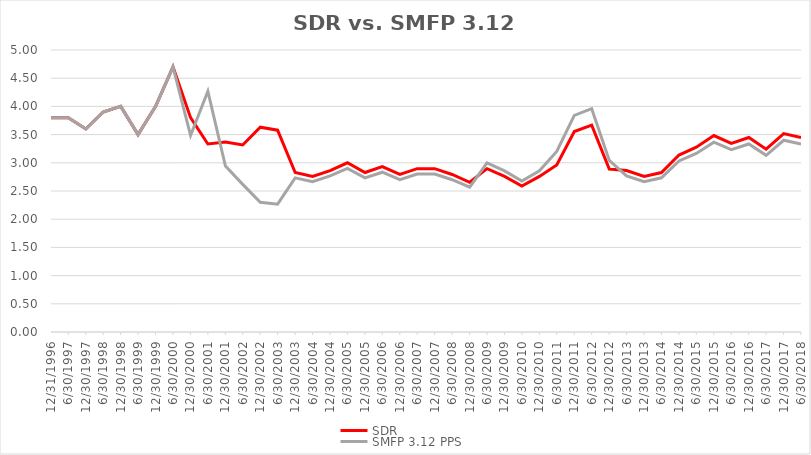
| Category | SDR | SMFP 3.12 PPS |
|---|---|---|
| 12/31/96 | 3.8 | 3.8 |
| 6/30/97 | 3.8 | 3.8 |
| 12/31/97 | 3.6 | 3.6 |
| 6/30/98 | 3.9 | 3.9 |
| 12/31/98 | 4 | 4 |
| 6/30/99 | 3.5 | 3.5 |
| 12/31/99 | 4 | 4 |
| 6/30/00 | 4.7 | 4.7 |
| 12/31/00 | 3.8 | 3.484 |
| 6/30/01 | 3.333 | 4.269 |
| 12/31/01 | 3.368 | 2.942 |
| 6/30/02 | 3.316 | 2.617 |
| 12/31/02 | 3.632 | 2.3 |
| 6/30/03 | 3.579 | 2.267 |
| 12/31/03 | 2.828 | 2.733 |
| 6/30/04 | 2.759 | 2.667 |
| 12/31/04 | 2.862 | 2.767 |
| 6/30/05 | 3 | 2.9 |
| 12/31/05 | 2.828 | 2.733 |
| 6/30/06 | 2.931 | 2.833 |
| 12/31/06 | 2.793 | 2.7 |
| 6/30/07 | 2.897 | 2.8 |
| 12/31/07 | 2.897 | 2.8 |
| 6/30/08 | 2.793 | 2.7 |
| 12/31/08 | 2.655 | 2.567 |
| 6/30/09 | 2.897 | 3 |
| 12/31/09 | 2.759 | 2.857 |
| 6/30/10 | 2.586 | 2.679 |
| 12/31/10 | 2.759 | 2.857 |
| 6/30/11 | 2.963 | 3.2 |
| 12/31/11 | 3.556 | 3.84 |
| 6/30/12 | 3.667 | 3.96 |
| 12/31/12 | 2.889 | 3.042 |
| 6/30/13 | 2.862 | 2.767 |
| 12/31/13 | 2.759 | 2.667 |
| 6/30/14 | 2.828 | 2.733 |
| 12/31/14 | 3.138 | 3.033 |
| 6/30/15 | 3.276 | 3.167 |
| 12/31/15 | 3.483 | 3.367 |
| 6/30/16 | 3.345 | 3.233 |
| 12/31/16 | 3.448 | 3.333 |
| 6/30/17 | 3.241 | 3.133 |
| 12/31/17 | 3.517 | 3.4 |
| 6/30/18 | 3.448 | 3.333 |